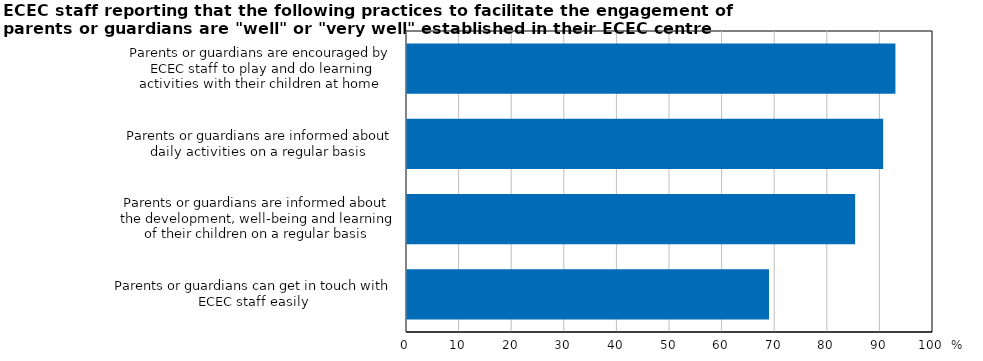
| Category | STAFF |
|---|---|
| Parents or guardians can get in touch with ECEC staff easily  | 68.821 |
| Parents or guardians are informed about the development, well-being and learning of their children on a regular basis | 85.2 |
| Parents or guardians are informed about daily activities on a regular basis  | 90.523 |
| Parents or guardians are encouraged by ECEC staff to play and do learning activities with their children at home  | 92.855 |